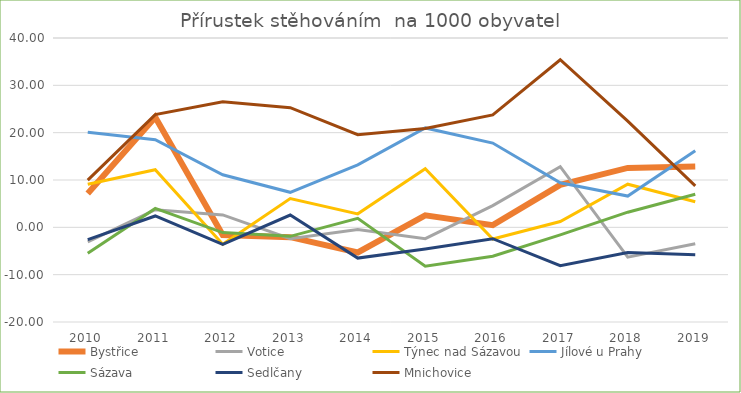
| Category | Bystřice | Votice | Týnec nad Sázavou | Jílové u Prahy | Sázava | Sedlčany | Mnichovice |
|---|---|---|---|---|---|---|---|
| 2010 | 7.131 | -3.068 | 9.093 | 20.1 | -5.5 | -2.6 | 9.971 |
| 2011 | 23.272 | 3.711 | 12.173 | 18.5 | 4 | 2.4 | 23.825 |
| 2012 | -1.611 | 2.614 | -3.574 | 11.1 | -1.1 | -3.6 | 26.521 |
| 2013 | -2.07 | -2.398 | 6.07 | 7.4 | -1.9 | 2.6 | 25.278 |
| 2014 | -5.307 | -0.435 | 2.85 | 13.2 | 1.9 | -6.5 | 19.585 |
| 2015 | 2.533 | -2.405 | 12.392 | 21 | -8.2 | -4.6 | 20.863 |
| 2016 | 0.459 | 4.592 | -2.461 | 17.8 | -6.1 | -2.4 | 23.756 |
| 2017 | 8.982 | 12.826 | 1.23 | 9.4 | -1.6 | -8.1 | 35.405 |
| 2018 | 12.543 | -6.296 | 9.108 | 6.6 | 3.2 | -5.3 | 22.443 |
| 2019 | 12.861 | -3.486 | 5.417 | 16.2 | 7 | -5.8 | 8.765 |